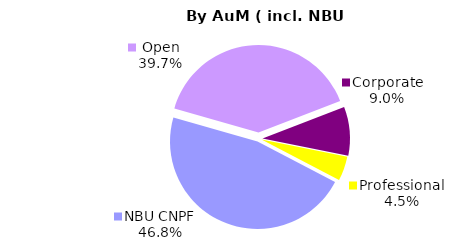
| Category | Series 0 |
|---|---|
| Open | 1233.068 |
| Corporate | 279.898 |
| Professional | 140.455 |
| NBU CNPF | 1453.079 |